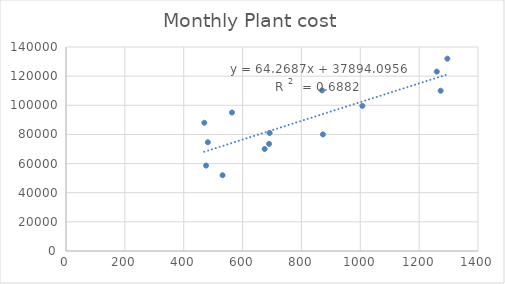
| Category | Monthly Plant cost |
|---|---|
| 1260.0 | 123118 |
| 1007.0 | 99601 |
| 1296.0 | 132000 |
| 873.0 | 80000 |
| 532.0 | 52000 |
| 476.0 | 58625 |
| 482.0 | 74624 |
| 1273.0 | 110000 |
| 692.0 | 81000 |
| 690.0 | 73507 |
| 564.0 | 95024 |
| 470.0 | 88004 |
| 675.0 | 70000 |
| 870.0 | 110253 |